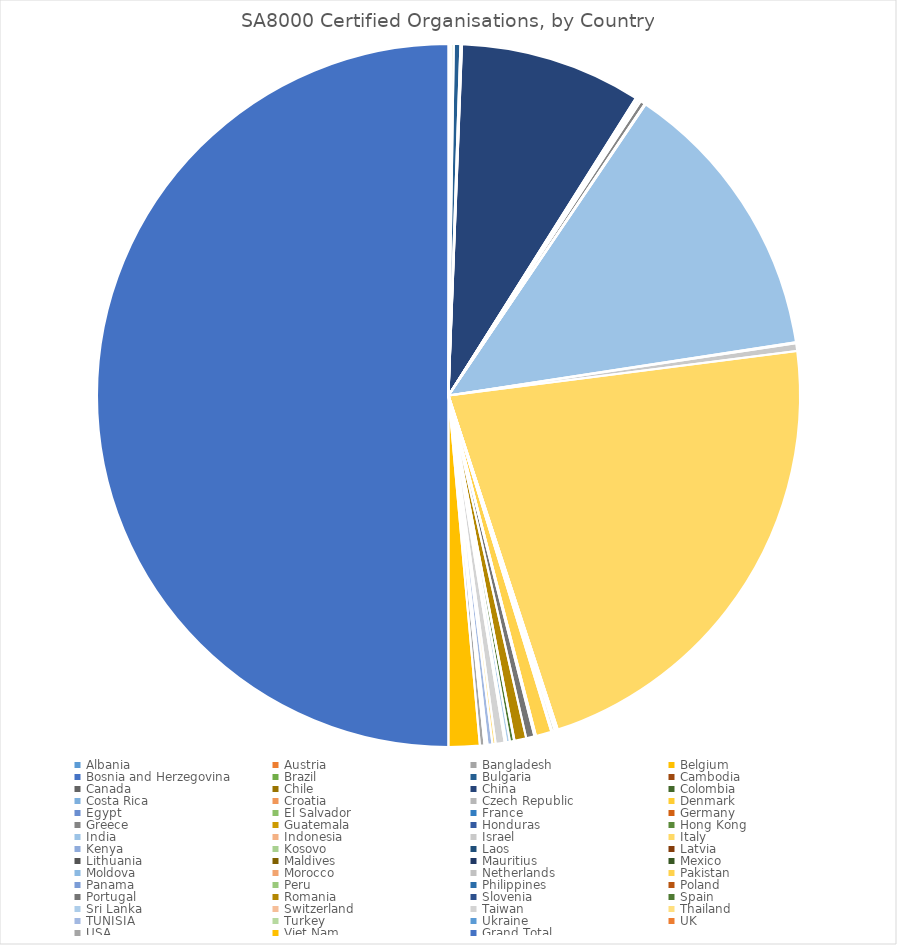
| Category | Number Currently Certified |
|---|---|
| Albania | 4 |
| Austria | 1 |
| Bangladesh | 5 |
| Belgium | 1 |
| Bosnia and Herzegovina | 2 |
| Brazil | 10 |
| Bulgaria | 28 |
| Cambodia | 4 |
| Canada | 2 |
| Chile | 1 |
| China | 788 |
| Colombia | 2 |
| Costa Rica | 1 |
| Croatia | 3 |
| Czech Republic | 2 |
| Denmark | 2 |
| Egypt | 4 |
| El Salvador | 1 |
| France | 1 |
| Germany | 9 |
| Greece | 21 |
| Guatemala | 1 |
| Honduras | 1 |
| Hong Kong | 2 |
| India | 1239 |
| Indonesia | 5 |
| Israel | 33 |
| Italy | 2080 |
| Kenya | 0 |
| Kosovo | 1 |
| Laos | 1 |
| Latvia | 1 |
| Lithuania | 8 |
| Maldives | 1 |
| Mauritius | 2 |
| Mexico | 10 |
| Moldova | 1 |
| Morocco | 2 |
| Netherlands | 2 |
| Pakistan | 68 |
| Panama | 1 |
| Peru | 2 |
| Philippines | 1 |
| Poland | 3 |
| Portugal | 36 |
| Romania | 51 |
| Slovenia | 2 |
| Spain | 18 |
| Sri Lanka | 16 |
| Switzerland | 7 |
| Taiwan | 39 |
| Thailand | 14 |
| TUNISIA | 21 |
| Turkey | 8 |
| Ukraine | 4 |
| UK | 1 |
| USA | 20 |
| Viet Nam | 135 |
| Grand Total | 4729 |